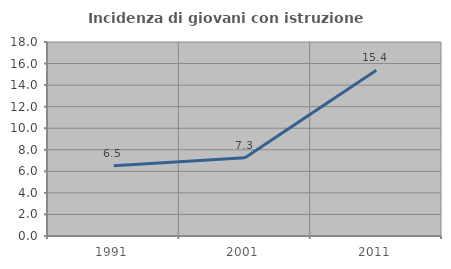
| Category | Incidenza di giovani con istruzione universitaria |
|---|---|
| 1991.0 | 6.513 |
| 2001.0 | 7.256 |
| 2011.0 | 15.385 |